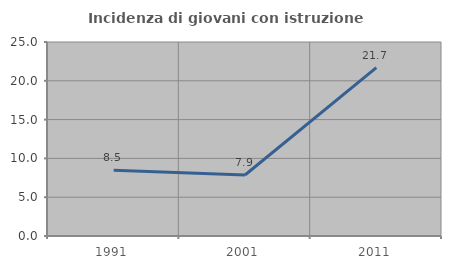
| Category | Incidenza di giovani con istruzione universitaria |
|---|---|
| 1991.0 | 8.475 |
| 2001.0 | 7.865 |
| 2011.0 | 21.687 |